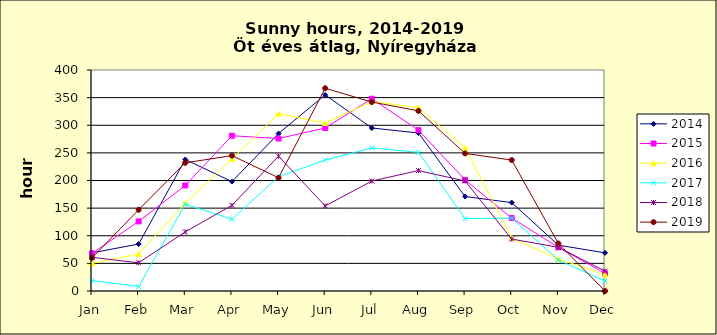
| Category | 2014 | 2015 | 2016 | 2017 | 2018 | 2019 |
|---|---|---|---|---|---|---|
| Jan | 69 | 68 | 50 | 19 | 61 | 60 |
| Feb | 85 | 126 | 67 | 8 | 51 | 147 |
| Mar | 238 | 191 | 159 | 157 | 107 | 232 |
| Apr | 198 | 281 | 239 | 130 | 155 | 245 |
| May | 285 | 276 | 321 | 207 | 244 | 205 |
| Jun | 355 | 295 | 304 | 237 | 154 | 367 |
| Jul | 295 | 348 | 343 | 259 | 199 | 342 |
| Aug | 286 | 291 | 332 | 251 | 218 | 326 |
| Sep | 171 | 201 | 259 | 131 | 199 | 249 |
| Oct | 160 | 132 | 96 | 132 | 94 | 237 |
| Nov | 83 | 79 | 58 | 56 | 79 | 86 |
| Dec | 69 | 32 | 30 | 18 | 36 | 0 |